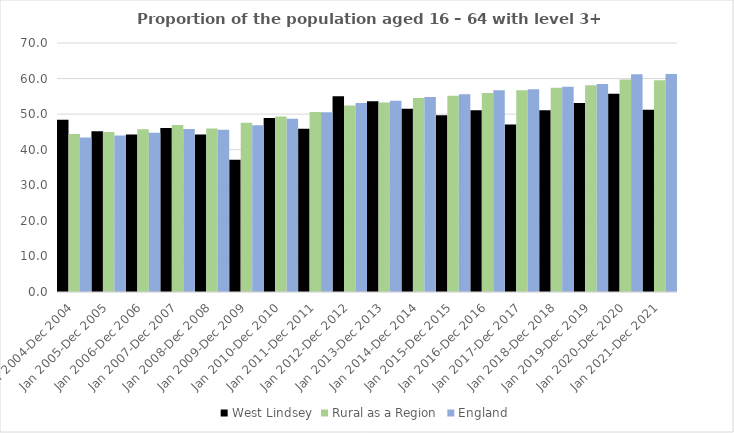
| Category | West Lindsey | Rural as a Region | England |
|---|---|---|---|
| Jan 2004-Dec 2004 | 48.4 | 44.405 | 43.4 |
| Jan 2005-Dec 2005 | 45.2 | 44.973 | 44 |
| Jan 2006-Dec 2006 | 44.3 | 45.774 | 44.8 |
| Jan 2007-Dec 2007 | 46.1 | 46.968 | 45.8 |
| Jan 2008-Dec 2008 | 44.3 | 45.964 | 45.6 |
| Jan 2009-Dec 2009 | 37.2 | 47.59 | 46.9 |
| Jan 2010-Dec 2010 | 48.9 | 49.362 | 48.7 |
| Jan 2011-Dec 2011 | 45.9 | 50.602 | 50.5 |
| Jan 2012-Dec 2012 | 55 | 52.439 | 53.1 |
| Jan 2013-Dec 2013 | 53.6 | 53.276 | 53.8 |
| Jan 2014-Dec 2014 | 51.5 | 54.57 | 54.8 |
| Jan 2015-Dec 2015 | 49.7 | 55.16 | 55.6 |
| Jan 2016-Dec 2016 | 51.1 | 55.941 | 56.7 |
| Jan 2017-Dec 2017 | 47.1 | 56.689 | 57 |
| Jan 2018-Dec 2018 | 51.1 | 57.389 | 57.7 |
| Jan 2019-Dec 2019 | 53.1 | 58.147 | 58.5 |
| Jan 2020-Dec 2020 | 55.7 | 59.771 | 61.2 |
| Jan 2021-Dec 2021 | 51.2 | 59.54 | 61.3 |